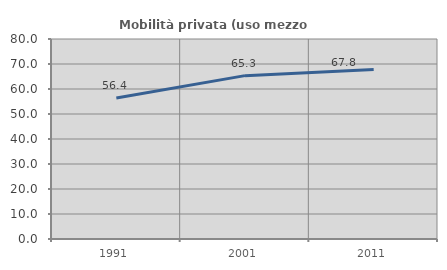
| Category | Mobilità privata (uso mezzo privato) |
|---|---|
| 1991.0 | 56.383 |
| 2001.0 | 65.343 |
| 2011.0 | 67.834 |